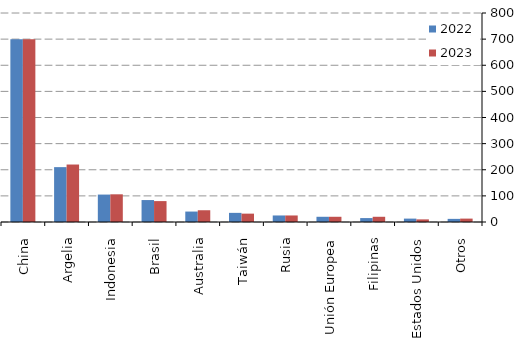
| Category | 2022 | 2023 |
|---|---|---|
| China | 700 | 700 |
| Argelia | 210 | 220 |
| Indonesia | 105 | 106 |
| Brasil | 84 | 80 |
| Australia | 40 | 45 |
| Taiwán | 35 | 32 |
| Rusia | 25 | 25 |
| Unión Europea | 20 | 20 |
| Filipinas | 15 | 20 |
| Estados Unidos | 13 | 10 |
| Otros | 12 | 13 |